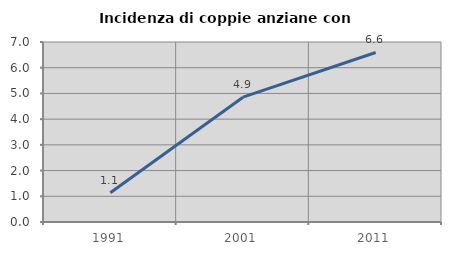
| Category | Incidenza di coppie anziane con figli |
|---|---|
| 1991.0 | 1.136 |
| 2001.0 | 4.854 |
| 2011.0 | 6.593 |